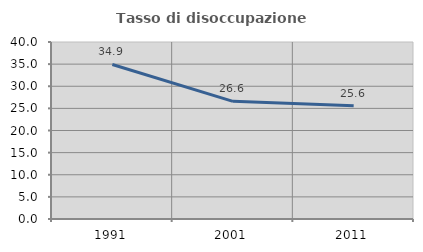
| Category | Tasso di disoccupazione giovanile  |
|---|---|
| 1991.0 | 34.921 |
| 2001.0 | 26.582 |
| 2011.0 | 25.61 |